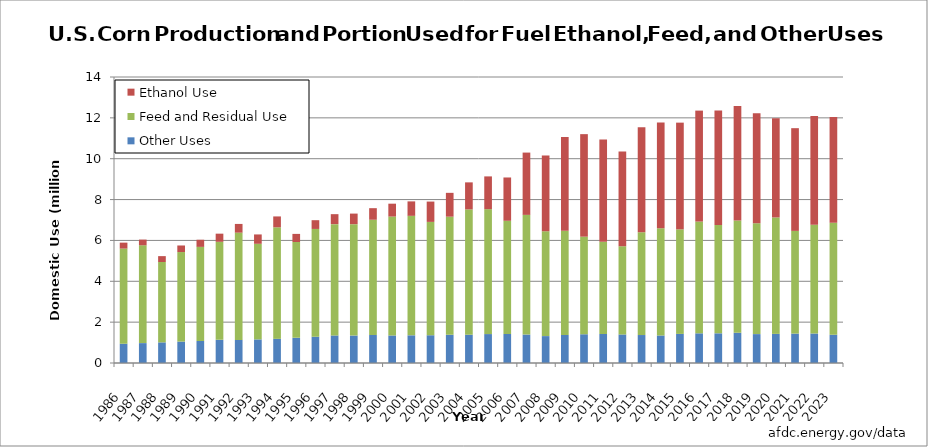
| Category | Other Uses | Feed and Residual Use | Ethanol Use |
|---|---|---|---|
| 1986.0 | 943 | 4659 | 289.992 |
| 1987.0 | 973 | 4789 | 279.146 |
| 1988.0 | 1010 | 3934 | 287.445 |
| 1989.0 | 1049 | 4382 | 321.446 |
| 1990.0 | 1076 | 4609 | 349.068 |
| 1991.0 | 1135 | 4798 | 398.264 |
| 1992.0 | 1130 | 5252 | 425.51 |
| 1993.0 | 1155 | 4680 | 458.259 |
| 1994.0 | 1182 | 5460 | 532.793 |
| 1995.0 | 1232 | 4692 | 395.68 |
| 1996.0 | 1285 | 5277 | 428.721 |
| 1997.0 | 1348 | 5450 | 487.732 |
| 1998.0 | 1344 | 5452 | 517.82 |
| 1999.0 | 1370 | 5643 | 565.847 |
| 2000.0 | 1347 | 5822 | 629.827 |
| 2001.0 | 1355 | 5849 | 707.238 |
| 2002.0 | 1359 | 5548 | 995.504 |
| 2003.0 | 1381 | 5781 | 1167.548 |
| 2004.0 | 1384 | 6135 | 1323.213 |
| 2005.0 | 1416 | 6115 | 1603.324 |
| 2006.0 | 1422 | 5540 | 2119.494 |
| 2007.0 | 1393 | 5858 | 3049.214 |
| 2008.0 | 1316 | 5133 | 3708.889 |
| 2009.0 | 1370 | 5101 | 4591.157 |
| 2010.0 | 1407 | 4777 | 5018.741 |
| 2011.0 | 1421 | 4520 | 5000 |
| 2012.0 | 1397 | 4315 | 4641 |
| 2013.0 | 1369 | 5034 | 5134 |
| 2014.0 | 1347 | 5250 | 5175 |
| 2015.0 | 1424 | 5118 | 5224 |
| 2016.0 | 1453 | 5470 | 5432 |
| 2017.0 | 1453 | 5298 | 5605 |
| 2018.0 | 1480 | 5500 | 5600 |
| 2019.0 | 1414 | 5430 | 5378 |
| 2020.0 | 1425 | 5700 | 4856 |
| 2021.0 | 1439 | 5028 | 5028 |
| 2022.0 | 1444 | 5323 | 5326 |
| 2023.0 | 1383 | 5486 | 5176 |